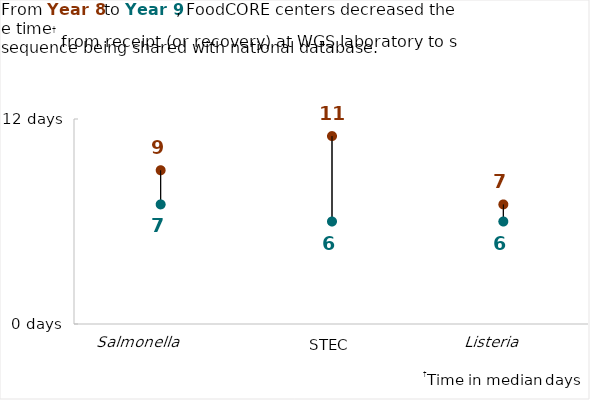
| Category | Year 8 | Year 9 |
|---|---|---|
| Salmonella | 9 | 7 |
| STEC | 11 | 6 |
| Listeria | 7 | 6 |